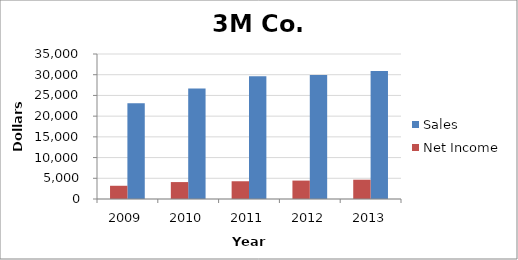
| Category | Sales | Net Income |
|---|---|---|
| 2013.0 | 30871 | 4659 |
| 2012.0 | 29904 | 4444 |
| 2011.0 | 29611 | 4283 |
| 2010.0 | 26662 | 4085 |
| 2009.0 | 23123 | 3193 |